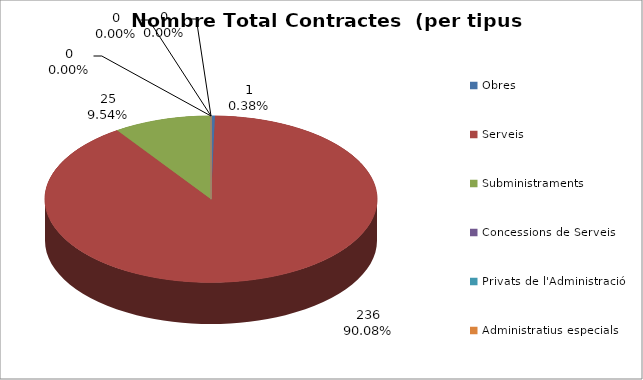
| Category | Nombre Total Contractes |
|---|---|
| Obres | 1 |
| Serveis | 236 |
| Subministraments | 25 |
| Concessions de Serveis | 0 |
| Privats de l'Administració | 0 |
| Administratius especials | 0 |